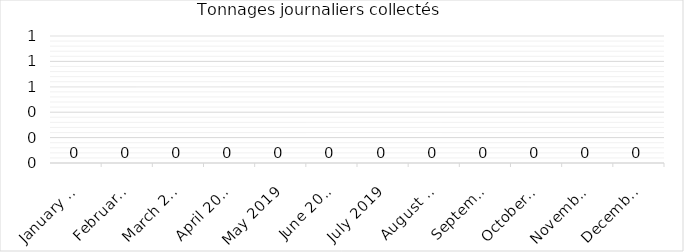
| Category | Tonnage journalier |
|---|---|
| 2019-01-01 | 0 |
| 2019-02-01 | 0 |
| 2019-03-01 | 0 |
| 2019-04-01 | 0 |
| 2019-05-01 | 0 |
| 2019-06-01 | 0 |
| 2019-07-01 | 0 |
| 2019-08-01 | 0 |
| 2019-09-01 | 0 |
| 2019-10-01 | 0 |
| 2019-11-01 | 0 |
| 2019-12-01 | 0 |